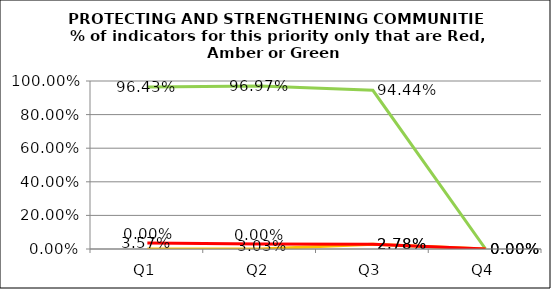
| Category | Green | Amber | Red |
|---|---|---|---|
| Q1 | 0.964 | 0 | 0.036 |
| Q2 | 0.97 | 0 | 0.03 |
| Q3 | 0.944 | 0.028 | 0.028 |
| Q4 | 0 | 0 | 0 |